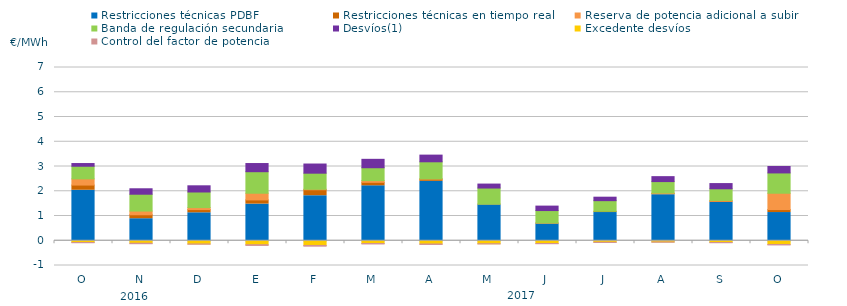
| Category | Restricciones técnicas PDBF | Restricciones técnicas en tiempo real | Reserva de potencia adicional a subir | Banda de regulación secundaria | Desvíos(1) | Excedente desvíos | Control del factor de potencia |
|---|---|---|---|---|---|---|---|
| O | 2.04 | 0.21 | 0.25 | 0.51 | 0.11 | -0.07 | -0.05 |
| N | 0.89 | 0.16 | 0.15 | 0.68 | 0.22 | -0.1 | -0.06 |
| D | 1.13 | 0.13 | 0.08 | 0.63 | 0.25 | -0.13 | -0.05 |
| E | 1.48 | 0.17 | 0.27 | 0.87 | 0.33 | -0.16 | -0.07 |
| F | 1.82 | 0.24 | 0.02 | 0.65 | 0.37 | -0.19 | -0.07 |
| M | 2.22 | 0.14 | 0.07 | 0.52 | 0.34 | -0.11 | -0.06 |
| A | 2.4 | 0.09 | 0.01 | 0.69 | 0.27 | -0.13 | -0.06 |
| M | 1.45 | 0.03 | 0 | 0.65 | 0.16 | -0.12 | -0.05 |
| J | 0.69 | 0.02 | 0.01 | 0.5 | 0.18 | -0.11 | -0.05 |
| J | 1.14 | 0.05 | 0 | 0.43 | 0.14 | -0.06 | -0.05 |
| A | 1.86 | 0.05 | 0.02 | 0.46 | 0.2 | -0.05 | -0.05 |
| S | 1.55 | 0.05 | 0.03 | 0.47 | 0.21 | -0.07 | -0.05 |
| O | 1.14 | 0.12 | 0.66 | 0.82 | 0.26 | -0.15 | -0.06 |